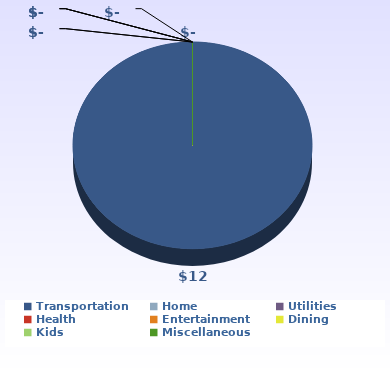
| Category | Series 2 |
|---|---|
| Transportation | 12 |
| Home | 0 |
| Utilities | 0 |
| Health | 0 |
| Entertainment | 0 |
| Dining | 0 |
| Kids | 0 |
| Miscellaneous | 0 |